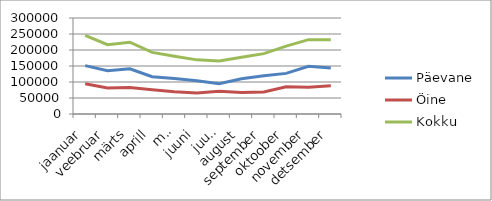
| Category | Päevane | Öine | Kokku |
|---|---|---|---|
| jaanuar | 151238.6 | 94505.7 | 245744.3 |
| veebruar | 135492 | 80953.8 | 216445.8 |
| märts | 141493.6 | 82806.1 | 224299.7 |
| aprill | 116624.6 | 75962.1 | 192586.7 |
| mai | 110944.8 | 69645.6 | 180590.4 |
| juuni | 103582.3 | 65574.2 | 169156.5 |
| juuli | 94547.742 | 71222.646 | 165770.388 |
| august | 110357.515 | 67027.974 | 177385.489 |
| september | 119735.012 | 68983.731 | 188718.743 |
| oktoober | 126967.799 | 85089.778 | 212057.577 |
| november | 149125.609 | 83282.717 | 232408.326 |
| detsember | 143735.397 | 88295.342 | 232030.739 |